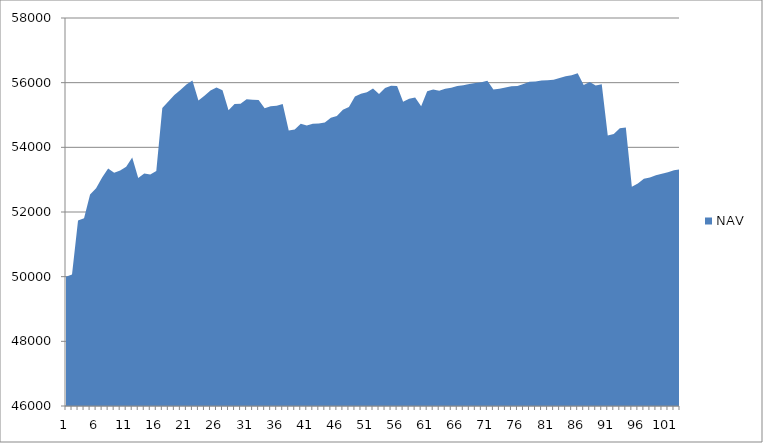
| Category | NAV |
|---|---|
| 0 | 50000 |
| 1 | 50069.444 |
| 2 | 51736.444 |
| 3 | 51809.343 |
| 4 | 52539.343 |
| 5 | 52733.57 |
| 6 | 53070.527 |
| 7 | 53346.212 |
| 8 | 53210.13 |
| 9 | 53285.788 |
| 10 | 53396.685 |
| 11 | 53684.185 |
| 12 | 53050.597 |
| 13 | 53191.058 |
| 14 | 53162.649 |
| 15 | 53270.317 |
| 16 | 55214.762 |
| 17 | 55418.583 |
| 18 | 55617.273 |
| 19 | 55770.477 |
| 20 | 55945.477 |
| 21 | 56069.601 |
| 22 | 55444.601 |
| 23 | 55597.925 |
| 24 | 55757.558 |
| 25 | 55851.308 |
| 26 | 55764.06 |
| 27 | 55148.361 |
| 28 | 55340.028 |
| 29 | 55349.317 |
| 30 | 55485.393 |
| 31 | 55468.704 |
| 32 | 55461.038 |
| 33 | 55205.356 |
| 34 | 55270.356 |
| 35 | 55282.57 |
| 36 | 55341.011 |
| 37 | 54517.482 |
| 38 | 54554.291 |
| 39 | 54731.016 |
| 40 | 54679.093 |
| 41 | 54730.595 |
| 42 | 54736.73 |
| 43 | 54765.085 |
| 44 | 54915.643 |
| 45 | 54969.86 |
| 46 | 55164.665 |
| 47 | 55247.746 |
| 48 | 55575.668 |
| 49 | 55657.905 |
| 50 | 55701.032 |
| 51 | 55819.28 |
| 52 | 55652.834 |
| 53 | 55838.604 |
| 54 | 55905.769 |
| 55 | 55898.888 |
| 56 | 55410.9 |
| 57 | 55504.564 |
| 58 | 55537.603 |
| 59 | 55268.471 |
| 60 | 55737.858 |
| 61 | 55785.708 |
| 62 | 55749.829 |
| 63 | 55815.591 |
| 64 | 55842.34 |
| 65 | 55894.021 |
| 66 | 55916.828 |
| 67 | 55955.697 |
| 68 | 55991.896 |
| 69 | 56012.065 |
| 70 | 56060.293 |
| 71 | 55791.443 |
| 72 | 55810.674 |
| 73 | 55852.843 |
| 74 | 55892.018 |
| 75 | 55900.069 |
| 76 | 55955.739 |
| 77 | 56030.918 |
| 78 | 56036.168 |
| 79 | 56069.975 |
| 80 | 56071.656 |
| 81 | 56090.406 |
| 82 | 56141.798 |
| 83 | 56199.159 |
| 84 | 56228.237 |
| 85 | 56292.573 |
| 86 | 55924.369 |
| 87 | 56019.106 |
| 88 | 55916.165 |
| 89 | 55950.09 |
| 90 | 54367.13 |
| 91 | 54411.811 |
| 92 | 54588.933 |
| 93 | 54611.197 |
| 94 | 52777.117 |
| 95 | 52883.107 |
| 96 | 53025.651 |
| 97 | 53064.908 |
| 98 | 53135.652 |
| 99 | 53186.005 |
| 100 | 53229.789 |
| 101 | 53290.192 |
| 102 | 53319.038 |